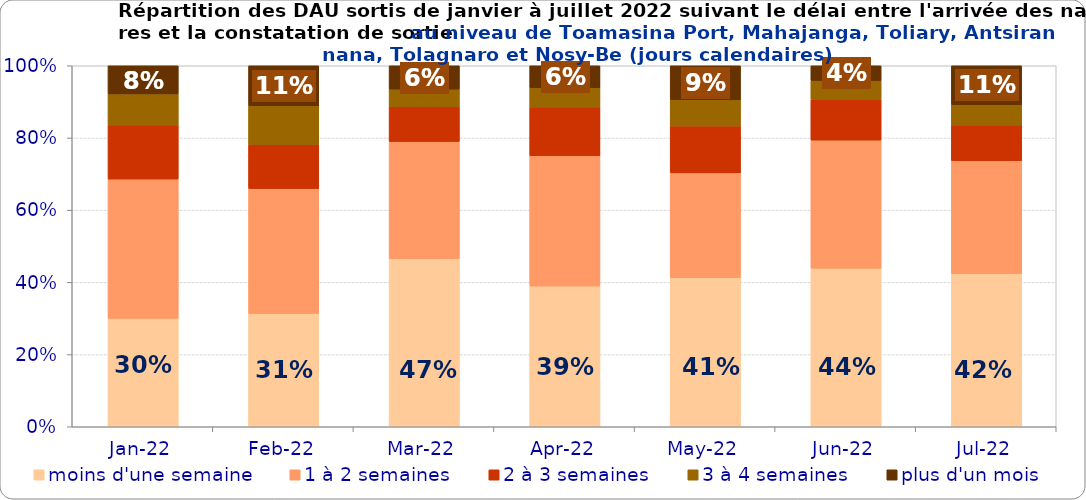
| Category | moins d'une semaine | 1 à 2 semaines | 2 à 3 semaines | 3 à 4 semaines | plus d'un mois |
|---|---|---|---|---|---|
| 2022-01-01 | 0.3 | 0.386 | 0.149 | 0.087 | 0.078 |
| 2022-02-01 | 0.314 | 0.346 | 0.122 | 0.107 | 0.111 |
| 2022-03-01 | 0.465 | 0.325 | 0.097 | 0.048 | 0.065 |
| 2022-04-01 | 0.39 | 0.361 | 0.135 | 0.054 | 0.061 |
| 2022-05-01 | 0.413 | 0.29 | 0.13 | 0.073 | 0.094 |
| 2022-06-01 | 0.439 | 0.355 | 0.112 | 0.053 | 0.041 |
| 2022-07-01 | 0.424 | 0.313 | 0.099 | 0.056 | 0.108 |